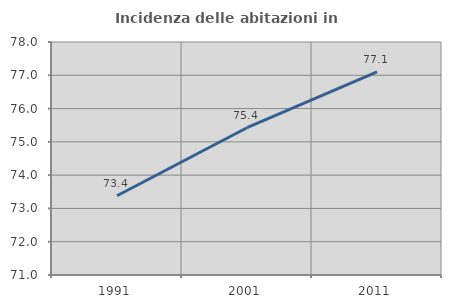
| Category | Incidenza delle abitazioni in proprietà  |
|---|---|
| 1991.0 | 73.382 |
| 2001.0 | 75.425 |
| 2011.0 | 77.101 |